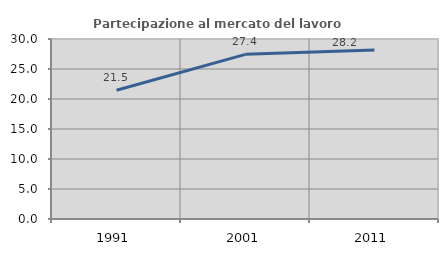
| Category | Partecipazione al mercato del lavoro  femminile |
|---|---|
| 1991.0 | 21.466 |
| 2001.0 | 27.439 |
| 2011.0 | 28.169 |